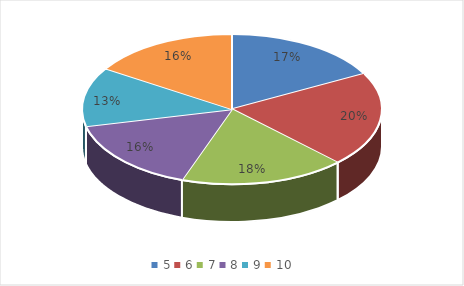
| Category | Series 0 |
|---|---|
| 5.0 | 27 |
| 6.0 | 32 |
| 7.0 | 28 |
| 8.0 | 25 |
| 9.0 | 20 |
| 10.0 | 25 |